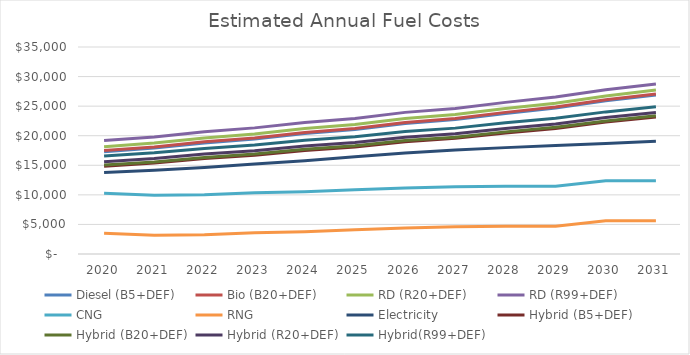
| Category | Diesel (B5+DEF) | Bio (B20+DEF) | RD (R20+DEF)  | RD (R99+DEF) | CNG | RNG | Electricity | Hybrid (B5+DEF) | Hybrid (B20+DEF) | Hybrid (R20+DEF) | Hybrid(R99+DEF) |
|---|---|---|---|---|---|---|---|---|---|---|---|
| 2020.0 | 17305.104 | 17485.394 | 18137.568 | 19187.423 | 10263.707 | 3500.422 | 13788.519 | 14853.206 | 15043.884 | 15615.918 | 16569.307 |
| 2021.0 | 17920.018 | 18099.418 | 18751.592 | 19800.556 | 9931.816 | 3168.531 | 14143.078 | 15384.748 | 15575.426 | 16147.46 | 17100.85 |
| 2022.0 | 18784.739 | 18963.226 | 19615.4 | 20663.453 | 10005.605 | 3242.32 | 14645.227 | 16135.213 | 16325.891 | 16897.925 | 17851.315 |
| 2023.0 | 19448.529 | 19626.083 | 20278.257 | 21325.376 | 10351.581 | 3588.296 | 15213.17 | 16709.247 | 16899.925 | 17471.958 | 18425.348 |
| 2024.0 | 20378.687 | 20555.285 | 21207.459 | 22253.622 | 10527.119 | 3763.834 | 15757.867 | 17516.719 | 17707.397 | 18279.431 | 19232.821 |
| 2025.0 | 21057.297 | 21232.916 | 21885.09 | 22930.274 | 10860.722 | 4097.437 | 16428.338 | 18103.353 | 18294.031 | 18866.065 | 19819.455 |
| 2026.0 | 22075.87 | 22250.486 | 22902.66 | 23946.842 | 11147.6 | 4384.315 | 17075.224 | 18987.969 | 19178.647 | 19750.681 | 20704.071 |
| 2027.0 | 22746.123 | 22919.713 | 23571.887 | 24615.041 | 11352.518 | 4589.233 | 17595.714 | 19566.856 | 19757.534 | 20329.568 | 21282.958 |
| 2028.0 | 23772.005 | 23944.544 | 24596.717 | 25638.821 | 11458.652 | 4695.367 | 17985.907 | 20457.456 | 20648.134 | 21220.168 | 22173.557 |
| 2029.0 | 24671.207 | 24842.669 | 25494.843 | 26535.87 | 11471.24 | 4707.955 | 18343.942 | 21236.72 | 21427.398 | 21999.432 | 22952.822 |
| 2030.0 | 25909.14 | 26079.5 | 26731.674 | 27771.599 | 12387.547 | 5624.262 | 18689.242 | 22312.866 | 22503.544 | 23075.578 | 24028.968 |
| 2031.0 | 26898.37 | 27067.601 | 27719.775 | 28758.571 | 12381.118 | 5617.833 | 19075.277 | 23170.638 | 23361.316 | 23933.349 | 24886.739 |